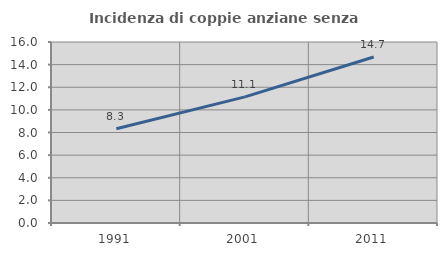
| Category | Incidenza di coppie anziane senza figli  |
|---|---|
| 1991.0 | 8.334 |
| 2001.0 | 11.146 |
| 2011.0 | 14.676 |